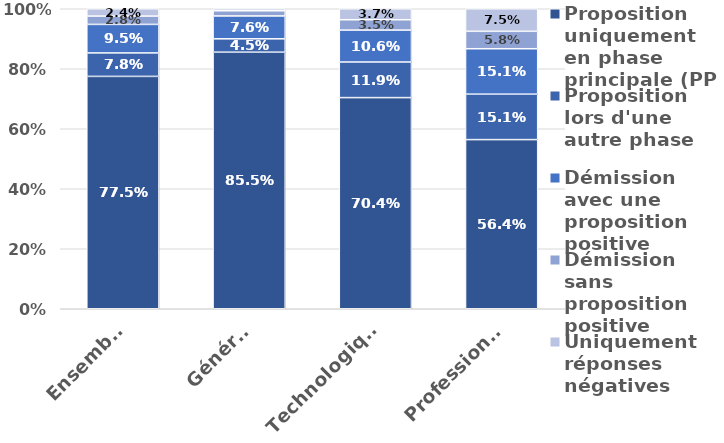
| Category | Proposition uniquement en phase principale (PP) | Proposition lors d'une autre phase | Démission avec une proposition positive | Démission sans proposition positive | Uniquement réponses négatives |
|---|---|---|---|---|---|
| Ensemble | 0.775 | 0.078 | 0.095 | 0.028 | 0.024 |
| Général | 0.855 | 0.045 | 0.076 | 0.017 | 0.007 |
| Technologique | 0.704 | 0.119 | 0.106 | 0.035 | 0.037 |
| Professionnel | 0.564 | 0.151 | 0.151 | 0.058 | 0.075 |